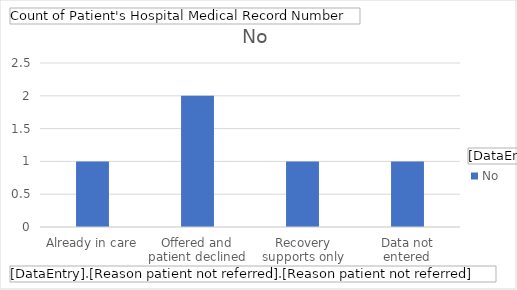
| Category | No |
|---|---|
| Already in care | 1 |
| Offered and patient declined | 2 |
| Recovery supports only | 1 |
| Data not entered | 1 |